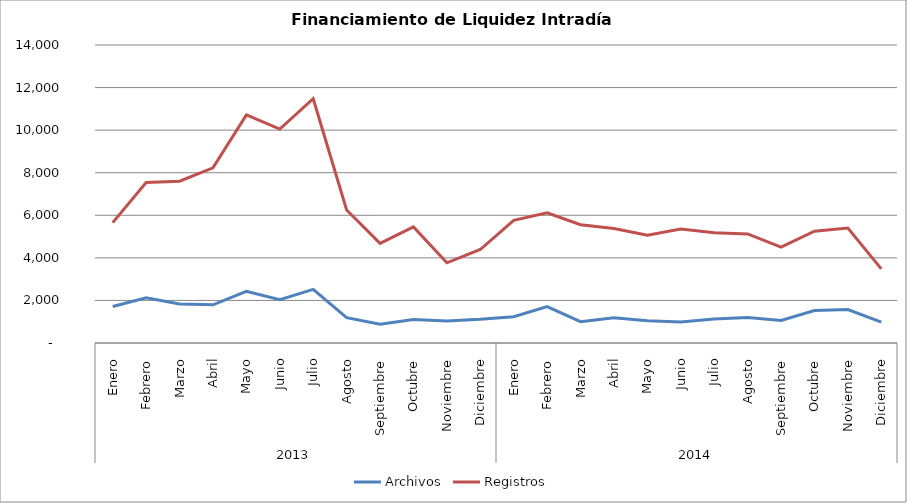
| Category | Archivos | Registros |
|---|---|---|
| 0 | 1712 | 5656 |
| 1 | 2124 | 7540 |
| 2 | 1829 | 7604 |
| 3 | 1792 | 8230 |
| 4 | 2430 | 10716 |
| 5 | 2038 | 10051 |
| 6 | 2521 | 11476 |
| 7 | 1192 | 6251 |
| 8 | 887 | 4680 |
| 9 | 1100 | 5453 |
| 10 | 1039 | 3768 |
| 11 | 1115 | 4392 |
| 12 | 1232 | 5766 |
| 13 | 1714 | 6115 |
| 14 | 1003 | 5554 |
| 15 | 1183 | 5377 |
| 16 | 1049 | 5063 |
| 17 | 986 | 5360 |
| 18 | 1124 | 5179 |
| 19 | 1200 | 5122 |
| 20 | 1059 | 4504 |
| 21 | 1522 | 5251 |
| 22 | 1570 | 5399 |
| 23 | 977 | 3484 |